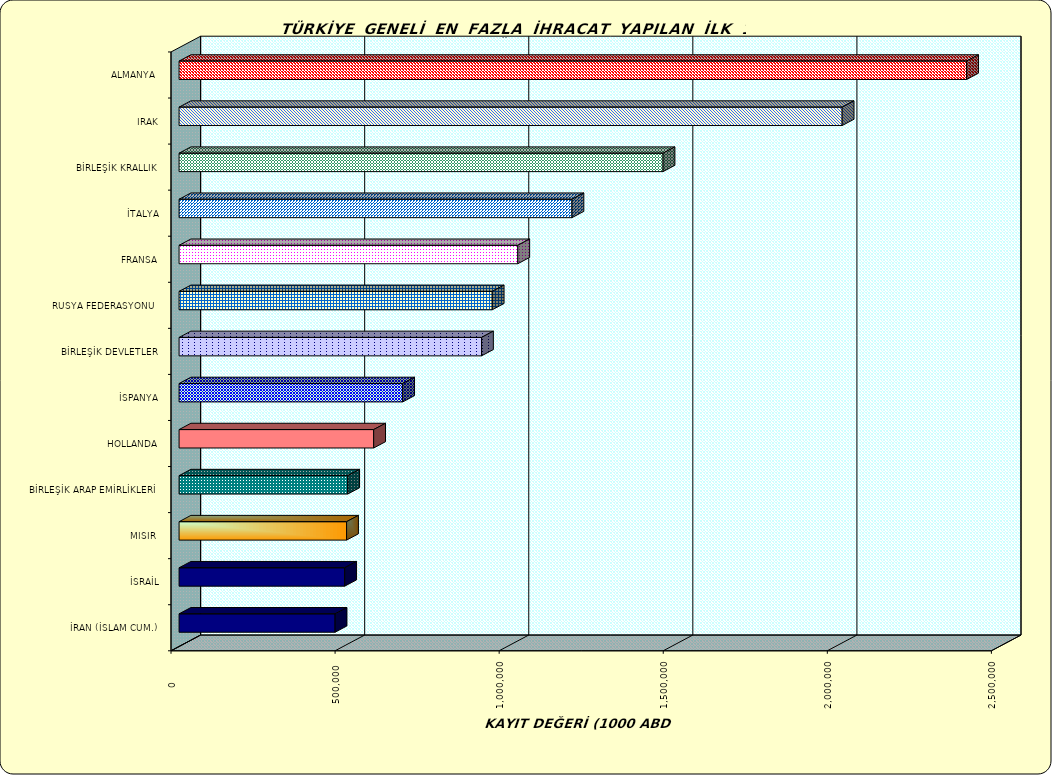
| Category | Series 0 |
|---|---|
| ALMANYA  | 2399905.609 |
| IRAK | 2020654.655 |
| BİRLEŞİK KRALLIK | 1474819.868 |
| İTALYA | 1197253.444 |
| FRANSA | 1032169.418 |
| RUSYA FEDERASYONU  | 954254.338 |
| BİRLEŞİK DEVLETLER | 921658.273 |
| İSPANYA | 681396.207 |
| HOLLANDA | 592950.314 |
| BİRLEŞİK ARAP EMİRLİKLERİ | 513918.262 |
| MISIR  | 510456.442 |
| İSRAİL | 504732.321 |
| İRAN (İSLAM CUM.) | 475413.67 |